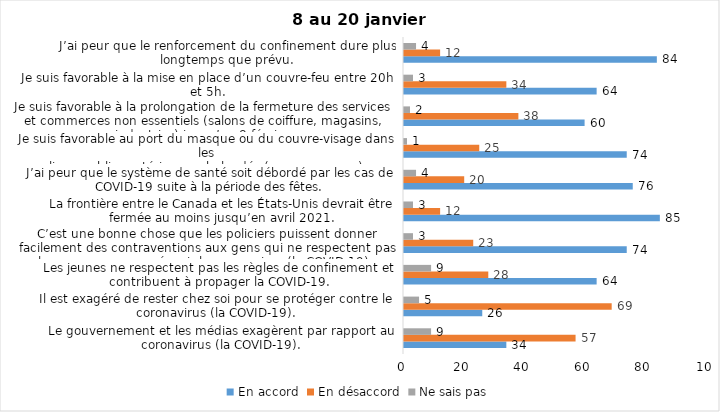
| Category | En accord | En désaccord | Ne sais pas |
|---|---|---|---|
| Le gouvernement et les médias exagèrent par rapport au coronavirus (la COVID-19). | 34 | 57 | 9 |
| Il est exagéré de rester chez soi pour se protéger contre le coronavirus (la COVID-19). | 26 | 69 | 5 |
| Les jeunes ne respectent pas les règles de confinement et contribuent à propager la COVID-19. | 64 | 28 | 9 |
| C’est une bonne chose que les policiers puissent donner facilement des contraventions aux gens qui ne respectent pas les mesures pour prévenir le coronavirus (la COVID-19). | 74 | 23 | 3 |
| La frontière entre le Canada et les États-Unis devrait être fermée au moins jusqu’en avril 2021. | 85 | 12 | 3 |
| J’ai peur que le système de santé soit débordé par les cas de COVID-19 suite à la période des fêtes. | 76 | 20 | 4 |
| Je suis favorable au port du masque ou du couvre-visage dans les
lieux publics extérieurs achalandés (ex. rues, parcs) | 74 | 25 | 1 |
| Je suis favorable à la prolongation de la fermeture des services et commerces non essentiels (salons de coiffure, magasins, industries) jusqu’au 8 février. | 60 | 38 | 2 |
| Je suis favorable à la mise en place d’un couvre-feu entre 20h et 5h. | 64 | 34 | 3 |
| J’ai peur que le renforcement du confinement dure plus longtemps que prévu. | 84 | 12 | 4 |